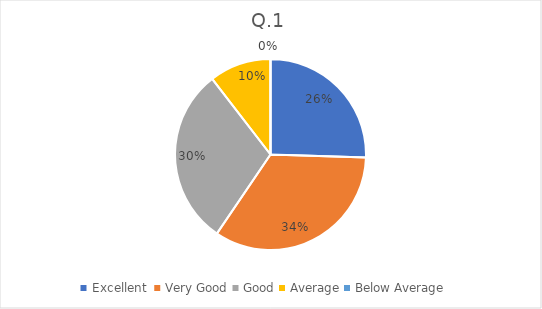
| Category | Series 0 |
|---|---|
| Excellent  | 39 |
| Very Good | 52 |
| Good | 46 |
| Average | 16 |
| Below Average | 0 |